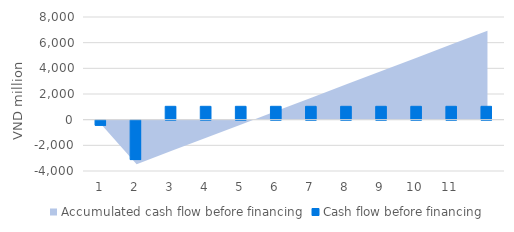
| Category | Cash flow before financing |
|---|---|
| 1.0 | -400 |
| 2.0 | -3069.11 |
| 3.0 | 1040.243 |
| 4.0 | 1040.243 |
| 5.0 | 1040.243 |
| 6.0 | 1040.243 |
| 7.0 | 1040.243 |
| 8.0 | 1040.243 |
| 9.0 | 1040.243 |
| 10.0 | 1040.243 |
| 11.0 | 1040.243 |